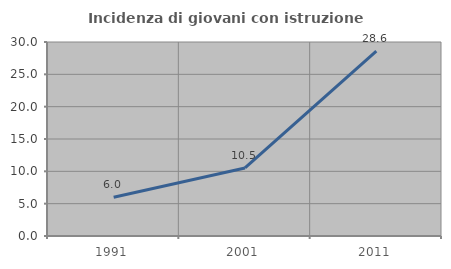
| Category | Incidenza di giovani con istruzione universitaria |
|---|---|
| 1991.0 | 6 |
| 2001.0 | 10.526 |
| 2011.0 | 28.571 |